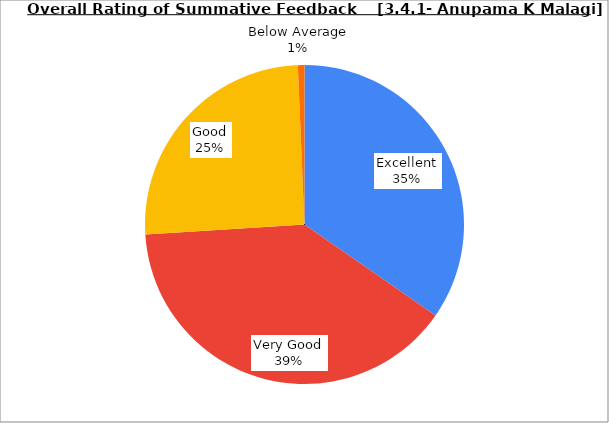
| Category | Series 0 |
|---|---|
| Excellent | 34.667 |
| Very Good | 39.333 |
| Good | 25.333 |
| Average | 0 |
| Below Average | 0.667 |